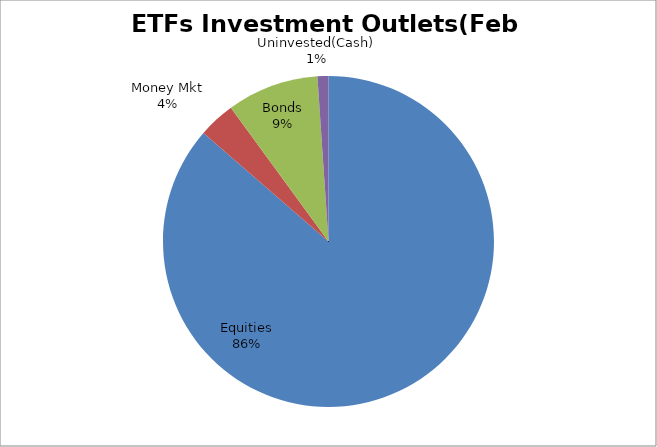
| Category | Series 0 |
|---|---|
| Equities | 4574101498.89 |
| Money Mkt | 190249365.75 |
| Bonds | 475081203.96 |
| Uninvested(Cash) | 56714065.08 |